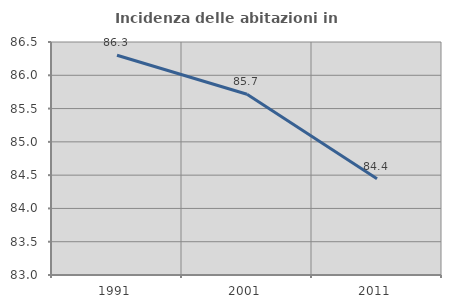
| Category | Incidenza delle abitazioni in proprietà  |
|---|---|
| 1991.0 | 86.301 |
| 2001.0 | 85.714 |
| 2011.0 | 84.444 |